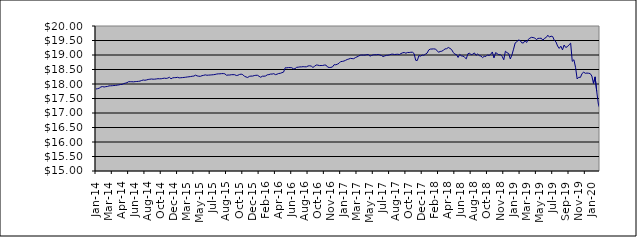
| Category | Series 0 |
|---|---|
| 2014-01-09 | 17.829 |
| 2014-01-17 | 17.839 |
| 2014-01-23 | 17.856 |
| 2014-01-31 | 17.898 |
| 2014-02-10 | 17.911 |
| 2014-02-14 | 17.896 |
| 2014-02-20 | 17.909 |
| 2014-02-28 | 17.915 |
| 2014-03-10 | 17.935 |
| 2014-03-14 | 17.938 |
| 2014-03-20 | 17.941 |
| 2014-03-26 | 17.948 |
| 2014-03-31 | 17.951 |
| 2014-04-09 | 17.961 |
| 2014-04-15 | 17.969 |
| 2014-04-24 | 17.982 |
| 2014-04-30 | 17.986 |
| 2014-05-08 | 18.015 |
| 2014-05-16 | 18.029 |
| 2014-05-22 | 18.045 |
| 2014-05-31 | 18.08 |
| 2014-06-09 | 18.08 |
| 2014-06-16 | 18.079 |
| 2014-06-20 | 18.074 |
| 2014-06-30 | 18.082 |
| 2014-07-09 | 18.086 |
| 2014-07-15 | 18.091 |
| 2014-07-22 | 18.1 |
| 2014-07-31 | 18.122 |
| 2014-08-11 | 18.138 |
| 2014-08-14 | 18.129 |
| 2014-08-21 | 18.141 |
| 2014-08-30 | 18.157 |
| 2014-09-08 | 18.164 |
| 2014-09-16 | 18.173 |
| 2014-09-23 | 18.165 |
| 2014-09-30 | 18.167 |
| 2014-10-09 | 18.174 |
| 2014-10-16 | 18.183 |
| 2014-10-23 | 18.18 |
| 2014-10-31 | 18.181 |
| 2014-11-10 | 18.193 |
| 2014-11-13 | 18.202 |
| 2014-11-20 | 18.192 |
| 2014-11-29 | 18.204 |
| 2014-12-10 | 18.231 |
| 2014-12-18 | 18.179 |
| 2014-12-23 | 18.211 |
| 2014-12-30 | 18.22 |
| 2015-01-08 | 18.22 |
| 2015-01-15 | 18.23 |
| 2015-01-30 | 18.212 |
| 2015-02-10 | 18.216 |
| 2015-02-16 | 18.221 |
| 2015-02-19 | 18.226 |
| 2015-02-28 | 18.234 |
| 2015-03-10 | 18.242 |
| 2015-03-13 | 18.249 |
| 2015-03-19 | 18.257 |
| 2015-03-27 | 18.268 |
| 2015-04-07 | 18.273 |
| 2015-04-16 | 18.305 |
| 2015-04-27 | 18.28 |
| 2015-05-08 | 18.268 |
| 2015-05-14 | 18.264 |
| 2015-05-21 | 18.288 |
| 2015-05-27 | 18.298 |
| 2015-06-03 | 18.316 |
| 2015-06-09 | 18.302 |
| 2015-06-15 | 18.306 |
| 2015-06-22 | 18.31 |
| 2015-06-26 | 18.315 |
| 2015-07-02 | 18.32 |
| 2015-07-09 | 18.329 |
| 2015-07-14 | 18.343 |
| 2015-07-23 | 18.351 |
| 2015-07-29 | 18.351 |
| 2015-08-06 | 18.358 |
| 2015-08-13 | 18.36 |
| 2015-08-20 | 18.351 |
| 2015-08-27 | 18.302 |
| 2015-09-03 | 18.309 |
| 2015-09-09 | 18.31 |
| 2015-09-15 | 18.321 |
| 2015-09-21 | 18.322 |
| 2015-09-28 | 18.321 |
| 2015-10-07 | 18.293 |
| 2015-10-13 | 18.301 |
| 2015-10-22 | 18.329 |
| 2015-10-28 | 18.34 |
| 2015-11-04 | 18.323 |
| 2015-11-13 | 18.267 |
| 2015-11-19 | 18.242 |
| 2015-11-27 | 18.224 |
| 2015-12-03 | 18.263 |
| 2015-12-10 | 18.273 |
| 2015-12-15 | 18.272 |
| 2015-12-23 | 18.29 |
| 2015-12-29 | 18.3 |
| 2016-01-07 | 18.3 |
| 2016-01-14 | 18.266 |
| 2016-01-21 | 18.232 |
| 2016-01-28 | 18.269 |
| 2016-02-04 | 18.268 |
| 2016-02-11 | 18.277 |
| 2016-02-18 | 18.316 |
| 2016-02-25 | 18.324 |
| 2016-03-03 | 18.342 |
| 2016-03-10 | 18.343 |
| 2016-03-16 | 18.356 |
| 2016-03-29 | 18.323 |
| 2016-04-07 | 18.338 |
| 2016-04-14 | 18.363 |
| 2016-04-28 | 18.369 |
| 2016-05-05 | 18.391 |
| 2016-05-12 | 18.41 |
| 2016-05-19 | 18.56 |
| 2016-05-30 | 18.558 |
| 2016-06-03 | 18.566 |
| 2016-06-09 | 18.565 |
| 2016-06-15 | 18.562 |
| 2016-06-23 | 18.524 |
| 2016-06-29 | 18.527 |
| 2016-07-11 | 18.574 |
| 2016-07-14 | 18.58 |
| 2016-07-21 | 18.59 |
| 2016-07-28 | 18.59 |
| 2016-08-04 | 18.598 |
| 2016-08-11 | 18.593 |
| 2016-08-16 | 18.592 |
| 2016-08-24 | 18.622 |
| 2016-08-30 | 18.629 |
| 2016-09-08 | 18.616 |
| 2016-09-15 | 18.571 |
| 2016-09-22 | 18.611 |
| 2016-09-29 | 18.654 |
| 2016-10-06 | 18.651 |
| 2016-10-13 | 18.635 |
| 2016-10-20 | 18.638 |
| 2016-10-28 | 18.638 |
| 2016-11-03 | 18.653 |
| 2016-11-10 | 18.652 |
| 2016-11-15 | 18.584 |
| 2016-11-23 | 18.57 |
| 2016-11-29 | 18.572 |
| 2016-12-07 | 18.59 |
| 2016-12-14 | 18.666 |
| 2016-12-21 | 18.662 |
| 2016-12-28 | 18.682 |
| 2017-01-05 | 18.715 |
| 2017-01-16 | 18.773 |
| 2017-01-23 | 18.778 |
| 2017-01-30 | 18.792 |
| 2017-02-06 | 18.816 |
| 2017-02-13 | 18.845 |
| 2017-02-20 | 18.861 |
| 2017-02-27 | 18.884 |
| 2017-03-06 | 18.876 |
| 2017-03-13 | 18.873 |
| 2017-03-20 | 18.908 |
| 2017-03-27 | 18.936 |
| 2017-03-30 | 18.963 |
| 2017-04-10 | 18.993 |
| 2017-04-18 | 18.999 |
| 2017-04-24 | 18.996 |
| 2017-04-28 | 18.998 |
| 2017-05-08 | 19.011 |
| 2017-05-15 | 19.014 |
| 2017-05-22 | 18.961 |
| 2017-05-30 | 18.984 |
| 2017-06-06 | 19.006 |
| 2017-06-12 | 19.008 |
| 2017-06-15 | 19.008 |
| 2017-06-20 | 19.019 |
| 2017-06-29 | 19.002 |
| 2017-07-04 | 18.985 |
| 2017-07-10 | 18.946 |
| 2017-07-14 | 18.969 |
| 2017-07-19 | 18.987 |
| 2017-07-24 | 18.992 |
| 2017-07-28 | 19.006 |
| 2017-08-03 | 19.026 |
| 2017-08-09 | 19.029 |
| 2017-08-14 | 19.016 |
| 2017-08-21 | 19.022 |
| 2017-08-24 | 19.026 |
| 2017-08-30 | 19.016 |
| 2017-09-07 | 19.05 |
| 2017-09-14 | 19.077 |
| 2017-09-20 | 19.086 |
| 2017-09-29 | 19.061 |
| 2017-10-05 | 19.088 |
| 2017-10-11 | 19.086 |
| 2017-10-16 | 19.095 |
| 2017-10-23 | 19.095 |
| 2017-10-30 | 19.05 |
| 2017-11-07 | 18.817 |
| 2017-11-15 | 18.812 |
| 2017-11-23 | 18.98 |
| 2017-11-29 | 18.961 |
| 2017-12-07 | 18.998 |
| 2017-12-13 | 18.991 |
| 2017-12-18 | 19.029 |
| 2017-12-28 | 19.066 |
| 2018-01-08 | 19.174 |
| 2018-01-17 | 19.204 |
| 2018-01-24 | 19.206 |
| 2018-01-30 | 19.212 |
| 2018-02-05 | 19.204 |
| 2018-02-13 | 19.161 |
| 2018-02-19 | 19.094 |
| 2018-02-27 | 19.122 |
| 2018-03-07 | 19.13 |
| 2018-03-14 | 19.166 |
| 2018-03-21 | 19.21 |
| 2018-03-29 | 19.219 |
| 2018-04-10 | 19.259 |
| 2018-04-16 | 19.229 |
| 2018-04-23 | 19.188 |
| 2018-04-27 | 19.091 |
| 2018-05-10 | 19.029 |
| 2018-05-15 | 19.015 |
| 2018-05-22 | 18.915 |
| 2018-05-30 | 19.02 |
| 2018-06-06 | 18.971 |
| 2018-06-13 | 18.963 |
| 2018-06-20 | 18.923 |
| 2018-06-29 | 18.867 |
| 2018-07-10 | 19.04 |
| 2018-07-16 | 19.066 |
| 2018-07-23 | 19.006 |
| 2018-07-30 | 19.027 |
| 2018-08-07 | 19.071 |
| 2018-08-13 | 18.988 |
| 2018-08-24 | 19.035 |
| 2018-08-30 | 18.98 |
| 2018-09-06 | 18.965 |
| 2018-09-13 | 18.909 |
| 2018-09-24 | 18.955 |
| 2018-09-28 | 18.947 |
| 2018-10-04 | 19.004 |
| 2018-10-10 | 18.984 |
| 2018-10-16 | 19.025 |
| 2018-10-23 | 19.105 |
| 2018-10-30 | 18.898 |
| 2018-11-07 | 19.082 |
| 2018-11-15 | 19.046 |
| 2018-11-21 | 19.006 |
| 2018-11-29 | 19.013 |
| 2018-12-07 | 18.954 |
| 2018-12-14 | 18.836 |
| 2018-12-21 | 19.131 |
| 2018-12-28 | 19.08 |
| 2019-01-08 | 19.053 |
| 2019-01-14 | 18.864 |
| 2019-01-21 | 19.002 |
| 2019-01-30 | 19.201 |
| 2019-02-11 | 19.415 |
| 2019-02-14 | 19.459 |
| 2019-02-21 | 19.513 |
| 2019-02-27 | 19.503 |
| 2019-03-07 | 19.421 |
| 2019-03-14 | 19.412 |
| 2019-03-21 | 19.496 |
| 2019-03-29 | 19.43 |
| 2019-04-04 | 19.536 |
| 2019-04-12 | 19.581 |
| 2019-04-18 | 19.61 |
| 2019-04-29 | 19.601 |
| 2019-05-08 | 19.587 |
| 2019-05-15 | 19.53 |
| 2019-05-23 | 19.573 |
| 2019-05-30 | 19.575 |
| 2019-06-10 | 19.578 |
| 2019-06-14 | 19.507 |
| 2019-06-21 | 19.577 |
| 2019-06-28 | 19.603 |
| 2019-07-04 | 19.682 |
| 2019-07-15 | 19.618 |
| 2019-07-22 | 19.65 |
| 2019-07-30 | 19.635 |
| 2019-08-06 | 19.506 |
| 2019-08-16 | 19.452 |
| 2019-08-22 | 19.31 |
| 2019-08-30 | 19.228 |
| 2019-09-09 | 19.304 |
| 2019-09-16 | 19.176 |
| 2019-09-20 | 19.344 |
| 2019-09-27 | 19.26 |
| 2019-10-03 | 19.286 |
| 2019-10-09 | 19.352 |
| 2019-10-15 | 19.408 |
| 2019-10-30 | 18.781 |
| 2019-11-07 | 18.837 |
| 2019-11-14 | 18.578 |
| 2019-11-21 | 18.173 |
| 2019-11-29 | 18.232 |
| 2019-12-05 | 18.228 |
| 2019-12-11 | 18.362 |
| 2019-12-17 | 18.407 |
| 2019-12-23 | 18.369 |
| 2019-12-30 | 18.377 |
| 2020-01-07 | 18.371 |
| 2020-01-15 | 18.358 |
| 2020-01-22 | 18.276 |
| 2020-01-30 | 18.021 |
| 2020-02-06 | 18.246 |
| 2020-02-14 | 17.74 |
| 2020-02-20 | 17.306 |
| 2020-02-28 | 17.133 |